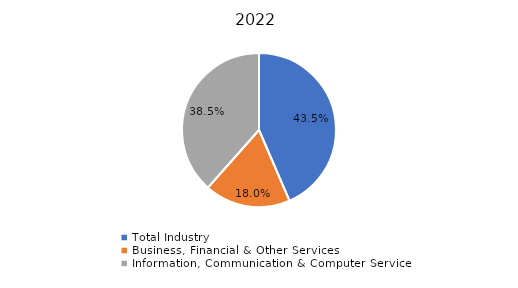
| Category | Series 0 |
|---|---|
| Total Industry | 0.435 |
| Business, Financial & Other Services | 0.18 |
| Information, Communication & Computer Services | 0.385 |